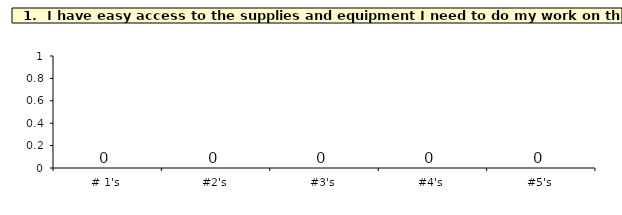
| Category | Q_1 |
|---|---|
| # 1's | 0 |
| #2's | 0 |
| #3's | 0 |
| #4's | 0 |
| #5's | 0 |